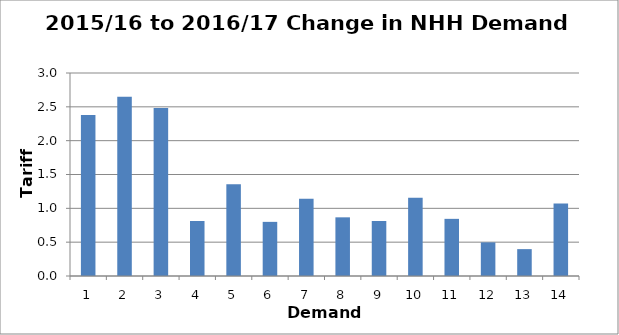
| Category | Change (p/kWh) |
|---|---|
| 0 | 2.379 |
| 1 | 2.647 |
| 2 | 2.482 |
| 3 | 0.813 |
| 4 | 1.358 |
| 5 | 0.8 |
| 6 | 1.14 |
| 7 | 0.867 |
| 8 | 0.813 |
| 9 | 1.158 |
| 10 | 0.845 |
| 11 | 0.497 |
| 12 | 0.397 |
| 13 | 1.071 |